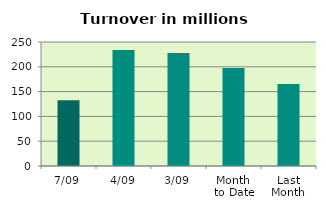
| Category | Series 0 |
|---|---|
| 7/09 | 132.656 |
| 4/09 | 233.709 |
| 3/09 | 227.723 |
| Month 
to Date | 197.583 |
| Last
Month | 165.075 |